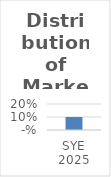
| Category | Series 0 |
|---|---|
| 2025.0 | 0.1 |